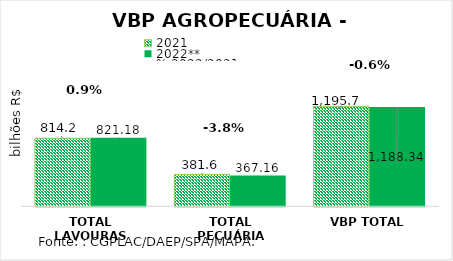
| Category | 2021 | 2022** |
|---|---|---|
| TOTAL LAVOURAS | 814.166 | 821.175 |
| TOTAL PECUÁRIA | 381.57 | 367.165 |
| VBP TOTAL | 1195.737 | 1188.34 |